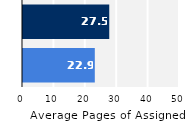
| Category | Series 0 |
|---|---|
| Upper Division | 22.868 |
| Lower Division | 27.471 |